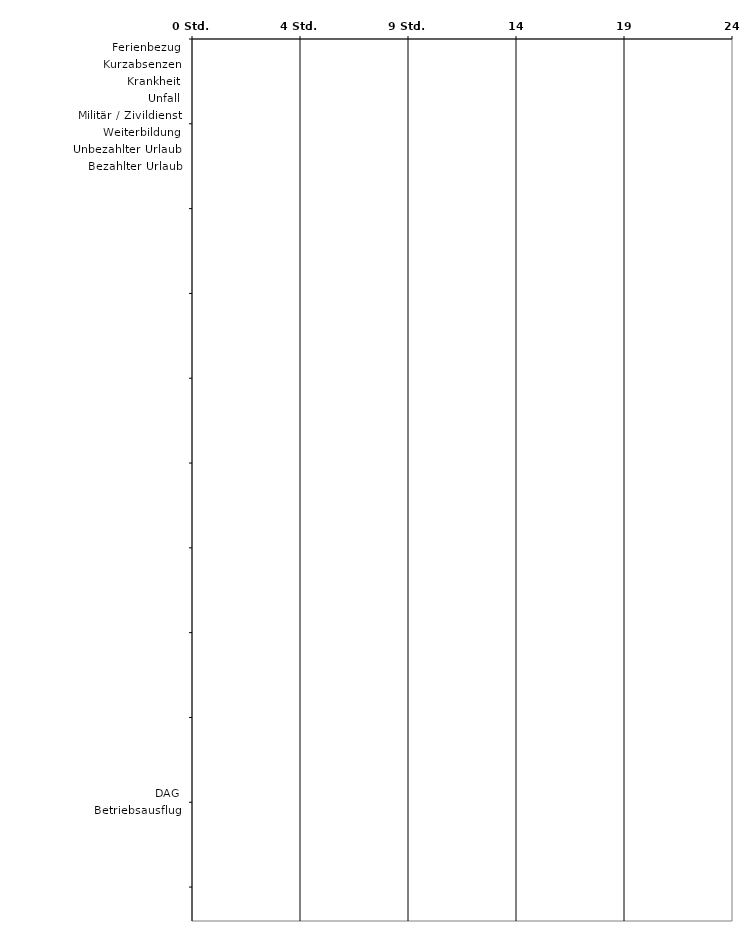
| Category | Series 0 |
|---|---|
| Ferienbezug | 0 |
| Kurzabsenzen | 0 |
| Krankheit | 0 |
| Unfall | 0 |
| Militär / Zivildienst | 0 |
| Weiterbildung | 0 |
| Unbezahlter Urlaub | 0 |
| Bezahlter Urlaub | 0 |
|  | 0 |
|  | 0 |
|  | 0 |
|  | 0 |
|  | 0 |
|  | 0 |
|  | 0 |
|  | 0 |
|  | 0 |
|  | 0 |
|  | 0 |
|  | 0 |
|  | 0 |
|  | 0 |
|  | 0 |
|  | 0 |
|  | 0 |
|  | 0 |
|  | 0 |
|  | 0 |
|  | 0 |
|  | 0 |
|  | 0 |
|  | 0 |
|  | 0 |
|  | 0 |
|  | 0 |
|  | 0 |
|  | 0 |
|  | 0 |
|  | 0 |
|  | 0 |
|  | 0 |
|  | 0 |
|  | 0 |
|  | 0 |
| DAG | 0 |
| Betriebsausflug | 0 |